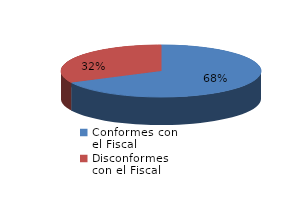
| Category | Series 0 |
|---|---|
| 0 | 2276 |
| 1 | 1090 |